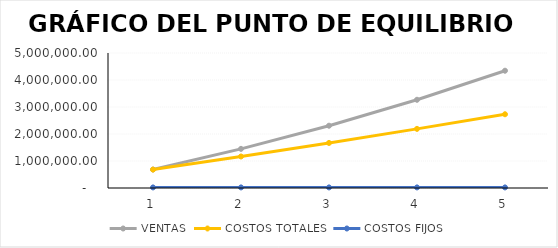
| Category | VENTAS | COSTOS TOTALES | COSTOS FIJOS |
|---|---|---|---|
| 0 | 683760 | 682276.28 | 21614.232 |
| 1 | 1449571.2 | 1166996.762 | 21614.232 |
| 2 | 2307279.744 | 1668934.119 | 21614.232 |
| 3 | 3267913.313 | 2189790.351 | 21614.232 |
| 4 | 4343822.911 | 2731436.673 | 21614.232 |